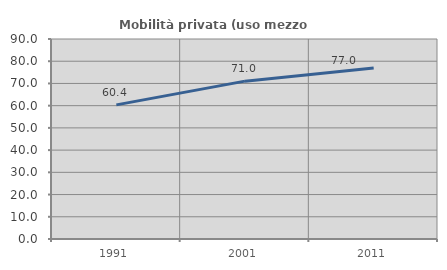
| Category | Mobilità privata (uso mezzo privato) |
|---|---|
| 1991.0 | 60.355 |
| 2001.0 | 71.038 |
| 2011.0 | 76.99 |